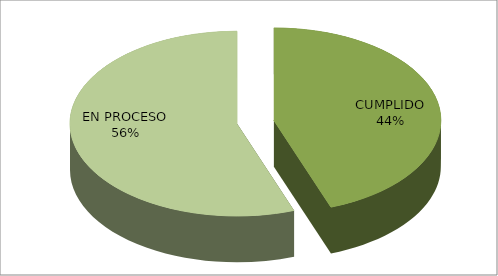
| Category | Series 0 |
|---|---|
| CUMPLIDO | 12 |
| EN PROCESO | 15 |